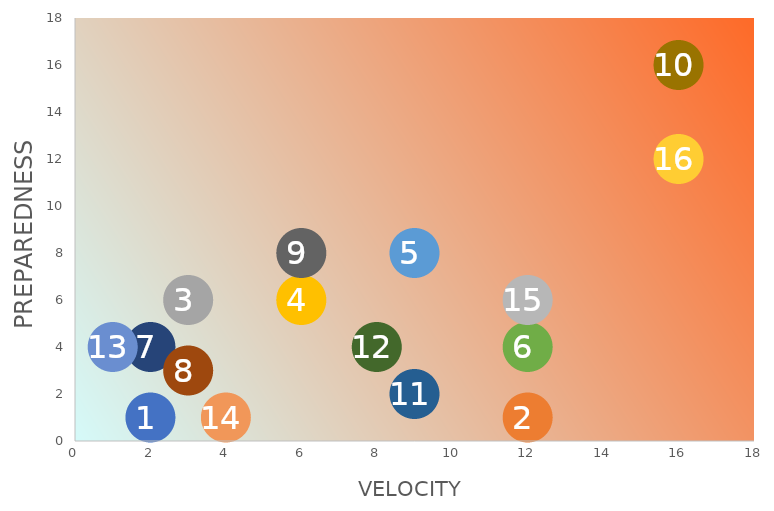
| Category | Series 0 |
|---|---|
| 2.0 | 1 |
| 12.0 | 1 |
| 3.0 | 6 |
| 6.0 | 6 |
| 9.0 | 8 |
| 12.0 | 4 |
| 2.0 | 4 |
| 3.0 | 3 |
| 6.0 | 8 |
| 16.0 | 16 |
| 9.0 | 2 |
| 8.0 | 4 |
| 1.0 | 4 |
| 4.0 | 1 |
| 12.0 | 6 |
| 16.0 | 12 |